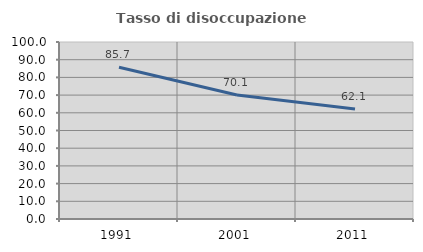
| Category | Tasso di disoccupazione giovanile  |
|---|---|
| 1991.0 | 85.731 |
| 2001.0 | 70.079 |
| 2011.0 | 62.135 |